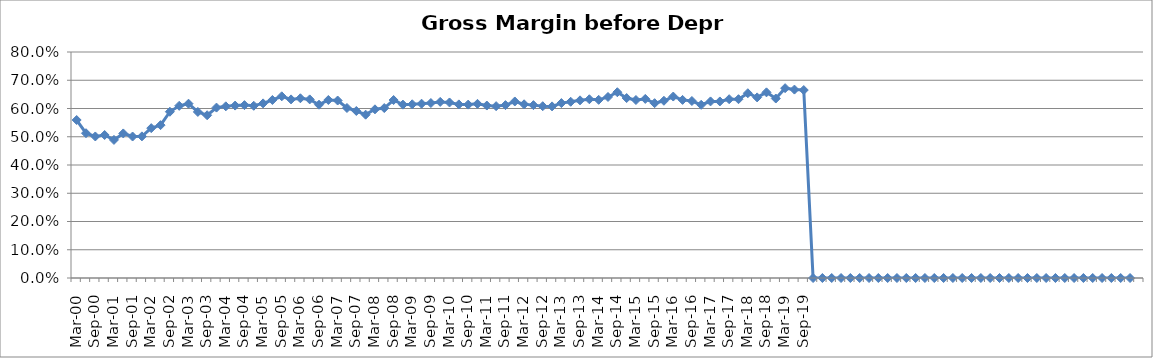
| Category | Gross Margin (before depr) % |
|---|---|
| Mar-00 | 0.559 |
| Jun-00 | 0.512 |
| Sep-00 | 0.501 |
| Dec-00 | 0.506 |
| Mar-01 | 0.489 |
| Jun-01 | 0.512 |
| Sep-01 | 0.501 |
| Dec-01 | 0.501 |
| Mar-02 | 0.53 |
| Jun-02 | 0.541 |
| Sep-02 | 0.589 |
| Dec-02 | 0.609 |
| Mar-03 | 0.617 |
| Jun-03 | 0.588 |
| Sep-03 | 0.576 |
| Dec-03 | 0.603 |
| Mar-04 | 0.608 |
| Jun-04 | 0.61 |
| Sep-04 | 0.612 |
| Dec-04 | 0.61 |
| Mar-05 | 0.618 |
| Jun-05 | 0.63 |
| Sep-05 | 0.643 |
| Dec-05 | 0.632 |
| Mar-06 | 0.636 |
| Jun-06 | 0.632 |
| Sep-06 | 0.613 |
| Dec-06 | 0.63 |
| Mar-07 | 0.628 |
| Jun-07 | 0.602 |
| Sep-07 | 0.591 |
| Dec-07 | 0.578 |
| Mar-08 | 0.597 |
| Jun-08 | 0.602 |
| Sep-08 | 0.63 |
| Dec-08 | 0.614 |
| Mar-09 | 0.615 |
| Jun-09 | 0.617 |
| Sep-09 | 0.619 |
| Dec-09 | 0.623 |
| Mar-10 | 0.621 |
| Jun-10 | 0.615 |
| Sep-10 | 0.614 |
| Dec-10 | 0.617 |
| Mar-11 | 0.61 |
| Jun-11 | 0.608 |
| Sep-11 | 0.612 |
| Dec-11 | 0.625 |
| Mar-12 | 0.615 |
| Jun-12 | 0.612 |
| Sep-12 | 0.608 |
| Dec-12 | 0.607 |
| Mar-13 | 0.619 |
| Jun-13 | 0.624 |
| Sep-13 | 0.629 |
| Dec-13 | 0.633 |
| Mar-14 | 0.631 |
| Jun-14 | 0.641 |
| Sep-14 | 0.658 |
| Dec-14 | 0.637 |
| Mar-15 | 0.63 |
| Jun-15 | 0.634 |
| Sep-15 | 0.619 |
| Dec-15 | 0.627 |
| Mar-16 | 0.642 |
| Jun-16 | 0.63 |
| Sep-16 | 0.627 |
| Dec-16 | 0.613 |
| Mar-17 | 0.625 |
| Jun-17 | 0.625 |
| Sep-17 | 0.633 |
| Dec-17 | 0.633 |
| Mar-18 | 0.654 |
| Jun-18 | 0.639 |
| Sep-18 | 0.657 |
| Dec-18 | 0.635 |
| Mar-19 | 0.672 |
| Jun-19 | 0.667 |
| Sep-19 | 0.665 |